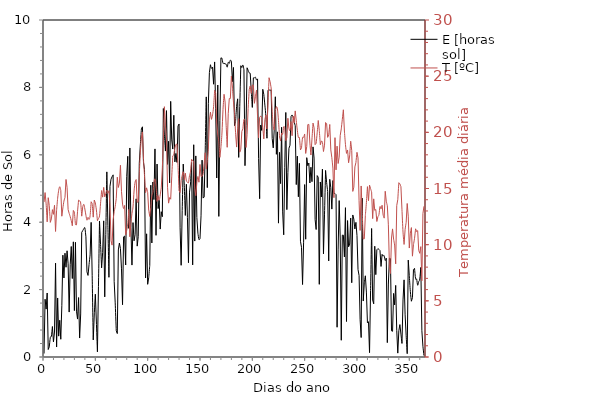
| Category | E [horas sol] |
|---|---|
| 1.0 | 0.103 |
| 2.0 | 1.714 |
| 3.0 | 1.421 |
| 4.0 | 1.9 |
| 5.0 | 0.222 |
| 6.0 | 0.301 |
| 7.0 | 0.579 |
| 8.0 | 0.615 |
| 9.0 | 0.905 |
| 10.0 | 0.449 |
| 11.0 | 0.74 |
| 12.0 | 2.784 |
| 13.0 | 0.296 |
| 14.0 | 1.752 |
| 15.0 | 0.619 |
| 16.0 | 1.091 |
| 17.0 | 0.527 |
| 18.0 | 1.522 |
| 19.0 | 3.022 |
| 20.0 | 2.345 |
| 21.0 | 3.08 |
| 22.0 | 2.663 |
| 23.0 | 3.152 |
| 24.0 | 2.765 |
| 25.0 | 1.333 |
| 26.0 | 2.736 |
| 27.0 | 3.279 |
| 28.0 | 2.328 |
| 29.0 | 3.418 |
| 30.0 | 1.377 |
| 31.0 | 3.404 |
| 32.0 | 1.36 |
| 33.0 | 1.125 |
| 34.0 | 1.764 |
| 35.0 | 0.563 |
| 36.0 | 1.277 |
| 37.0 | 3.698 |
| 38.0 | 3.753 |
| 39.0 | 3.804 |
| 40.0 | 3.83 |
| 41.0 | 3.566 |
| 42.0 | 2.527 |
| 43.0 | 2.421 |
| 44.0 | 2.741 |
| 45.0 | 3.03 |
| 46.0 | 3.994 |
| 47.0 | 2.412 |
| 48.0 | 0.507 |
| 49.0 | 1.278 |
| 50.0 | 1.864 |
| 51.0 | 1.039 |
| 52.0 | 0.153 |
| 53.0 | 2.093 |
| 54.0 | 4.034 |
| 55.0 | 3.34 |
| 56.0 | 2.646 |
| 57.0 | 3.095 |
| 58.0 | 4.04 |
| 59.0 | 1.784 |
| 60.0 | 3.638 |
| 61.0 | 5.493 |
| 62.0 | 3.906 |
| 63.0 | 2.365 |
| 64.0 | 5.064 |
| 65.0 | 5.274 |
| 66.0 | 5.35 |
| 67.0 | 5.405 |
| 68.0 | 2.245 |
| 69.0 | 1.607 |
| 70.0 | 0.778 |
| 71.0 | 0.695 |
| 72.0 | 3.177 |
| 73.0 | 3.383 |
| 74.0 | 3.219 |
| 75.0 | 2.616 |
| 76.0 | 1.551 |
| 77.0 | 3.566 |
| 78.0 | 3.588 |
| 79.0 | 2.73 |
| 80.0 | 5.361 |
| 81.0 | 5.955 |
| 82.0 | 3.816 |
| 83.0 | 6.203 |
| 84.0 | 3.836 |
| 85.0 | 2.727 |
| 86.0 | 3.988 |
| 87.0 | 3.448 |
| 88.0 | 3.626 |
| 89.0 | 4.694 |
| 90.0 | 3.29 |
| 91.0 | 3.572 |
| 92.0 | 5.747 |
| 93.0 | 6.291 |
| 94.0 | 6.764 |
| 95.0 | 6.831 |
| 96.0 | 5.776 |
| 97.0 | 5.557 |
| 98.0 | 2.344 |
| 99.0 | 3.655 |
| 100.0 | 2.157 |
| 101.0 | 2.354 |
| 102.0 | 2.718 |
| 103.0 | 5.098 |
| 104.0 | 3.384 |
| 105.0 | 5.191 |
| 106.0 | 4.671 |
| 107.0 | 6.175 |
| 108.0 | 3.61 |
| 109.0 | 5.725 |
| 110.0 | 4.405 |
| 111.0 | 4.651 |
| 112.0 | 3.796 |
| 113.0 | 4.312 |
| 114.0 | 4.162 |
| 115.0 | 7.374 |
| 116.0 | 6.591 |
| 117.0 | 6.111 |
| 118.0 | 7.311 |
| 119.0 | 5.715 |
| 120.0 | 6.401 |
| 121.0 | 5.167 |
| 122.0 | 7.585 |
| 123.0 | 6.442 |
| 124.0 | 6.17 |
| 125.0 | 7.173 |
| 126.0 | 5.789 |
| 127.0 | 6.039 |
| 128.0 | 5.775 |
| 129.0 | 6.854 |
| 130.0 | 6.915 |
| 131.0 | 3.833 |
| 132.0 | 2.721 |
| 133.0 | 4.343 |
| 134.0 | 5.724 |
| 135.0 | 5.096 |
| 136.0 | 4.2 |
| 137.0 | 5.126 |
| 138.0 | 4.142 |
| 139.0 | 2.797 |
| 140.0 | 4.893 |
| 141.0 | 5.162 |
| 142.0 | 5.775 |
| 143.0 | 2.732 |
| 144.0 | 6.298 |
| 145.0 | 3.44 |
| 146.0 | 5.967 |
| 147.0 | 4.14 |
| 148.0 | 3.675 |
| 149.0 | 3.486 |
| 150.0 | 3.511 |
| 151.0 | 4.189 |
| 152.0 | 5.842 |
| 153.0 | 4.716 |
| 154.0 | 4.749 |
| 155.0 | 6.144 |
| 156.0 | 7.718 |
| 157.0 | 5.026 |
| 158.0 | 7.516 |
| 159.0 | 8.439 |
| 160.0 | 8.672 |
| 161.0 | 8.567 |
| 162.0 | 8.603 |
| 163.0 | 8.094 |
| 164.0 | 8.756 |
| 165.0 | 7.38 |
| 166.0 | 5.311 |
| 167.0 | 8.071 |
| 168.0 | 4.172 |
| 169.0 | 7.011 |
| 170.0 | 8.876 |
| 171.0 | 8.866 |
| 172.0 | 8.716 |
| 173.0 | 8.716 |
| 174.0 | 8.696 |
| 175.0 | 8.689 |
| 176.0 | 8.601 |
| 177.0 | 8.745 |
| 178.0 | 8.714 |
| 179.0 | 8.809 |
| 180.0 | 8.777 |
| 181.0 | 8.17 |
| 182.0 | 8.591 |
| 183.0 | 6.865 |
| 184.0 | 6.991 |
| 185.0 | 7.432 |
| 186.0 | 7.661 |
| 187.0 | 5.923 |
| 188.0 | 7.431 |
| 189.0 | 8.643 |
| 190.0 | 8.589 |
| 191.0 | 8.665 |
| 192.0 | 8.525 |
| 193.0 | 5.677 |
| 194.0 | 6.874 |
| 195.0 | 8.582 |
| 196.0 | 8.508 |
| 197.0 | 8.433 |
| 198.0 | 8.417 |
| 199.0 | 7.889 |
| 200.0 | 7.406 |
| 201.0 | 8.283 |
| 202.0 | 8.285 |
| 203.0 | 8.301 |
| 204.0 | 8.222 |
| 205.0 | 8.252 |
| 206.0 | 5.888 |
| 207.0 | 4.697 |
| 208.0 | 6.881 |
| 209.0 | 6.722 |
| 210.0 | 7.944 |
| 211.0 | 7.791 |
| 212.0 | 7.475 |
| 213.0 | 7.118 |
| 214.0 | 6.492 |
| 215.0 | 7.917 |
| 216.0 | 7.93 |
| 217.0 | 7.914 |
| 218.0 | 7.927 |
| 219.0 | 6.483 |
| 220.0 | 6.205 |
| 221.0 | 6.778 |
| 222.0 | 7.722 |
| 223.0 | 6.015 |
| 224.0 | 6.681 |
| 225.0 | 3.972 |
| 226.0 | 6.072 |
| 227.0 | 5.145 |
| 228.0 | 6.818 |
| 229.0 | 4.306 |
| 230.0 | 3.626 |
| 231.0 | 5.627 |
| 232.0 | 7.256 |
| 233.0 | 4.372 |
| 234.0 | 5.475 |
| 235.0 | 6.194 |
| 236.0 | 6.283 |
| 237.0 | 7.136 |
| 238.0 | 7.183 |
| 239.0 | 7.125 |
| 240.0 | 6.983 |
| 241.0 | 6.862 |
| 242.0 | 5.116 |
| 243.0 | 5.961 |
| 244.0 | 4.754 |
| 245.0 | 5.747 |
| 246.0 | 3.434 |
| 247.0 | 3.254 |
| 248.0 | 2.15 |
| 249.0 | 3.406 |
| 250.0 | 5.116 |
| 251.0 | 3.495 |
| 252.0 | 5.915 |
| 253.0 | 5.676 |
| 254.0 | 5.754 |
| 255.0 | 5.163 |
| 256.0 | 5.631 |
| 257.0 | 5.202 |
| 258.0 | 6.235 |
| 259.0 | 5.903 |
| 260.0 | 4.076 |
| 261.0 | 3.783 |
| 262.0 | 5.383 |
| 263.0 | 5.332 |
| 264.0 | 2.156 |
| 265.0 | 5.193 |
| 266.0 | 4.748 |
| 267.0 | 5.576 |
| 268.0 | 3.061 |
| 269.0 | 4.239 |
| 270.0 | 5.536 |
| 271.0 | 5.175 |
| 272.0 | 4.913 |
| 273.0 | 2.851 |
| 274.0 | 5.272 |
| 275.0 | 5.026 |
| 276.0 | 4.389 |
| 277.0 | 5.236 |
| 278.0 | 4.852 |
| 279.0 | 4.852 |
| 280.0 | 4.818 |
| 281.0 | 0.883 |
| 282.0 | 3.2 |
| 283.0 | 4.641 |
| 284.0 | 3.531 |
| 285.0 | 0.497 |
| 286.0 | 3.616 |
| 287.0 | 3.616 |
| 288.0 | 2.97 |
| 289.0 | 4.431 |
| 290.0 | 1.053 |
| 291.0 | 4.049 |
| 292.0 | 3.269 |
| 293.0 | 3.352 |
| 294.0 | 4.122 |
| 295.0 | 2.203 |
| 296.0 | 4.215 |
| 297.0 | 4.092 |
| 298.0 | 3.799 |
| 299.0 | 3.996 |
| 300.0 | 3.606 |
| 301.0 | 2.595 |
| 302.0 | 2.418 |
| 303.0 | 1.106 |
| 304.0 | 0.578 |
| 305.0 | 4.713 |
| 306.0 | 1.66 |
| 307.0 | 2.203 |
| 308.0 | 2.41 |
| 309.0 | 1.926 |
| 310.0 | 1.014 |
| 311.0 | 1.047 |
| 312.0 | 0.128 |
| 313.0 | 1.971 |
| 314.0 | 3.813 |
| 315.0 | 1.691 |
| 316.0 | 1.577 |
| 317.0 | 3.286 |
| 318.0 | 2.444 |
| 319.0 | 3.181 |
| 320.0 | 3.217 |
| 321.0 | 3.193 |
| 322.0 | 3.158 |
| 323.0 | 2.687 |
| 324.0 | 3.046 |
| 325.0 | 2.993 |
| 326.0 | 3.007 |
| 327.0 | 2.863 |
| 328.0 | 2.934 |
| 329.0 | 0.426 |
| 330.0 | 2.165 |
| 331.0 | 2.929 |
| 332.0 | 2.919 |
| 333.0 | 0.777 |
| 334.0 | 0.762 |
| 335.0 | 1.887 |
| 336.0 | 1.545 |
| 337.0 | 2.125 |
| 338.0 | 0.79 |
| 339.0 | 0.115 |
| 340.0 | 0.781 |
| 341.0 | 0.962 |
| 342.0 | 0.679 |
| 343.0 | 0.402 |
| 344.0 | 1.694 |
| 345.0 | 2.289 |
| 346.0 | 1.251 |
| 347.0 | 0.631 |
| 348.0 | 0.098 |
| 349.0 | 2.876 |
| 350.0 | 2.413 |
| 351.0 | 1.944 |
| 352.0 | 1.654 |
| 353.0 | 1.761 |
| 354.0 | 2.598 |
| 355.0 | 2.63 |
| 356.0 | 2.322 |
| 357.0 | 2.313 |
| 358.0 | 2.129 |
| 359.0 | 2.238 |
| 360.0 | 2.314 |
| 361.0 | 2.658 |
| 362.0 | 0.781 |
| 363.0 | 0.319 |
| 364.0 | 0.042 |